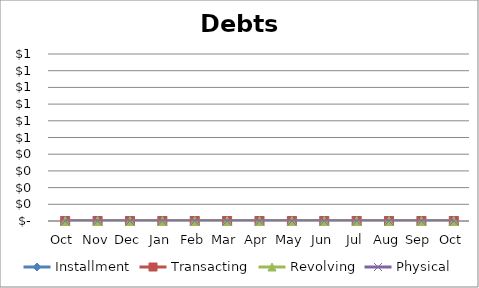
| Category | Installment | Transacting | Revolving | Physical |
|---|---|---|---|---|
| Oct | 0 | 0 | 0 | 0 |
| Nov | 0 | 0 | 0 | 0 |
| Dec | 0 | 0 | 0 | 0 |
| Jan | 0 | 0 | 0 | 0 |
| Feb | 0 | 0 | 0 | 0 |
| Mar | 0 | 0 | 0 | 0 |
| Apr | 0 | 0 | 0 | 0 |
| May | 0 | 0 | 0 | 0 |
| Jun | 0 | 0 | 0 | 0 |
| Jul | 0 | 0 | 0 | 0 |
| Aug | 0 | 0 | 0 | 0 |
| Sep | 0 | 0 | 0 | 0 |
| Oct | 0 | 0 | 0 | 0 |